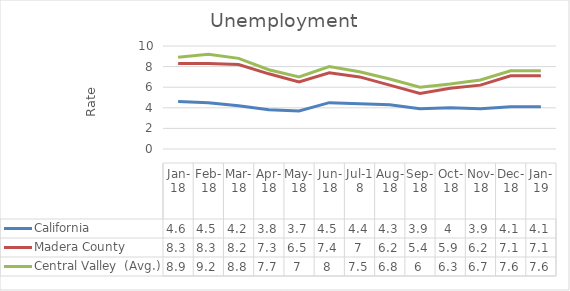
| Category | California | Madera County | Central Valley  (Avg.) |
|---|---|---|---|
| Jan-18 | 4.6 | 8.3 | 8.9 |
| Feb-18 | 4.5 | 8.3 | 9.2 |
| Mar-18 | 4.2 | 8.2 | 8.8 |
| Apr-18 | 3.8 | 7.3 | 7.7 |
| May-18 | 3.7 | 6.5 | 7 |
| Jun-18 | 4.5 | 7.4 | 8 |
| Jul-18 | 4.4 | 7 | 7.5 |
| Aug-18 | 4.3 | 6.2 | 6.8 |
| Sep-18 | 3.9 | 5.4 | 6 |
| Oct-18 | 4 | 5.9 | 6.3 |
| Nov-18 | 3.9 | 6.2 | 6.7 |
| Dec-18 | 4.1 | 7.1 | 7.6 |
| Jan-19 | 4.1 | 7.1 | 7.6 |